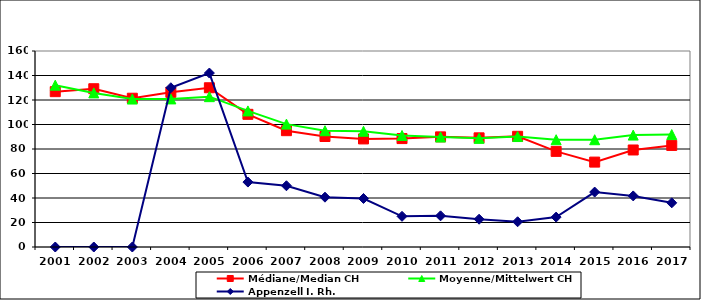
| Category | Médiane/Median CH | Moyenne/Mittelwert CH | Appenzell I. Rh. |
|---|---|---|---|
| 2001.0 | 126.8 | 132.1 | 0 |
| 2002.0 | 129.2 | 125.8 | 0 |
| 2003.0 | 121.45 | 120.775 | 0 |
| 2004.0 | 126.25 | 120.889 | 130 |
| 2005.0 | 130 | 122.728 | 142 |
| 2006.0 | 108.3 | 111.087 | 53 |
| 2007.0 | 94.96 | 100.307 | 50 |
| 2008.0 | 90.2 | 94.911 | 40.67 |
| 2009.0 | 88.22 | 94.453 | 39.6 |
| 2010.0 | 88.5 | 91.058 | 25.05 |
| 2011.0 | 89.9 | 89.805 | 25.45 |
| 2012.0 | 89.11 | 88.689 | 22.68 |
| 2013.0 | 90.35 | 90.167 | 20.6 |
| 2014.0 | 78.06 | 87.587 | 24.41 |
| 2015.0 | 69.3 | 87.576 | 44.84 |
| 2016.0 | 79.2 | 91.353 | 41.7 |
| 2017.0 | 82.9 | 91.779 | 36.06 |